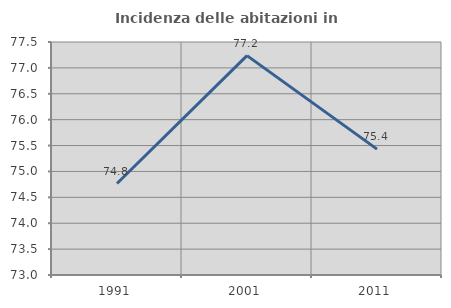
| Category | Incidenza delle abitazioni in proprietà  |
|---|---|
| 1991.0 | 74.766 |
| 2001.0 | 77.237 |
| 2011.0 | 75.431 |